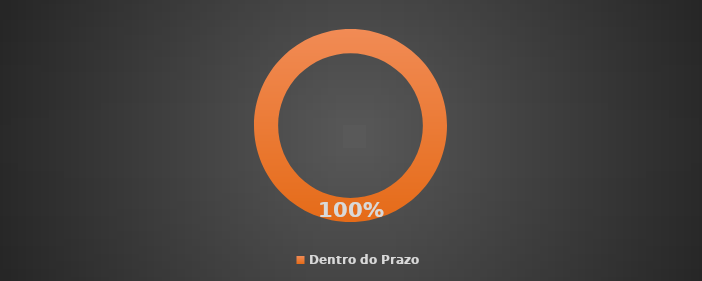
| Category | Total |
|---|---|
| Dentro do Prazo | 1 |